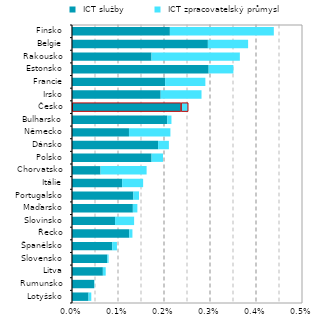
| Category |  ICT služby |  ICT zpracovatelský průmysl |
|---|---|---|
| Lotyšsko | 0 | 0 |
| Rumunsko | 0 | 0 |
| Litva | 0.001 | 0 |
| Slovensko | 0.001 | 0 |
| Španělsko | 0.001 | 0 |
| Řecko | 0.001 | 0 |
| Slovinsko | 0.001 | 0 |
| Maďarsko | 0.001 | 0 |
| Portugalsko | 0.001 | 0 |
| Itálie | 0.001 | 0 |
| Chorvatsko | 0.001 | 0.001 |
| Polsko | 0.002 | 0 |
| Dánsko | 0.002 | 0 |
| Německo | 0.001 | 0.001 |
| Bulharsko | 0.002 | 0 |
| Česko | 0.002 | 0 |
| Irsko | 0.002 | 0.001 |
| Francie | 0.002 | 0.001 |
| Estonsko | 0.003 | 0.001 |
| Rakousko | 0.002 | 0.002 |
| Belgie | 0.003 | 0.001 |
| Finsko | 0.002 | 0.002 |